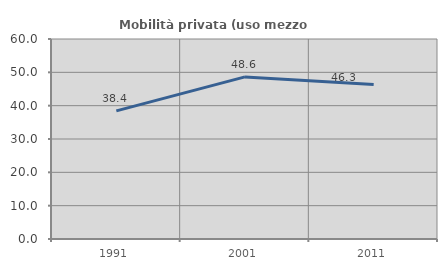
| Category | Mobilità privata (uso mezzo privato) |
|---|---|
| 1991.0 | 38.438 |
| 2001.0 | 48.634 |
| 2011.0 | 46.327 |